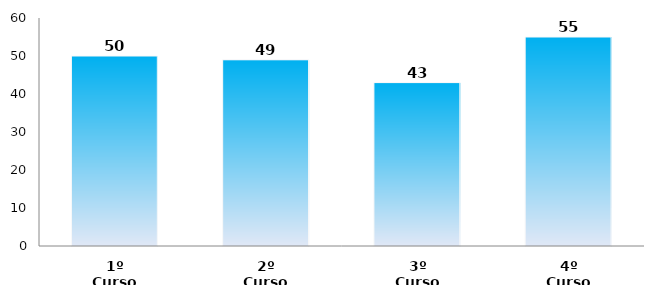
| Category | Series 0 |
|---|---|
| 1º Curso | 50 |
| 2º Curso | 49 |
| 3º Curso | 43 |
| 4º Curso | 55 |